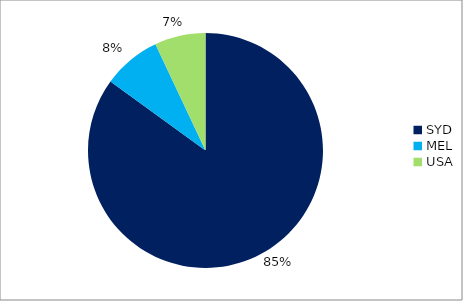
| Category | Series 0 |
|---|---|
| SYD | 0.85 |
| MEL | 0.08 |
| USA | 0.07 |